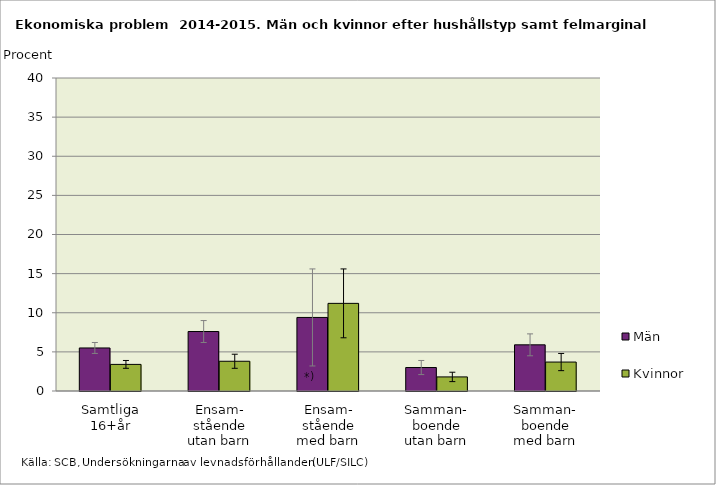
| Category | Män | Kvinnor |
|---|---|---|
| Samtliga
16+år | 5.5 | 3.4 |
| Ensam-
stående
utan barn | 7.6 | 3.8 |
| Ensam-
stående
med barn | 9.4 | 11.2 |
| Samman-
boende
utan barn | 3 | 1.8 |
| Samman-
boende
med barn | 5.9 | 3.7 |